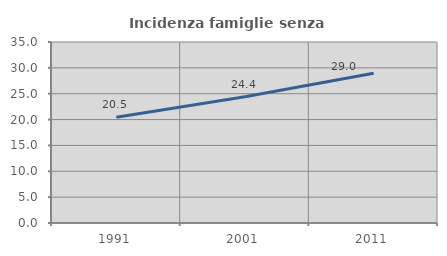
| Category | Incidenza famiglie senza nuclei |
|---|---|
| 1991.0 | 20.465 |
| 2001.0 | 24.431 |
| 2011.0 | 28.952 |